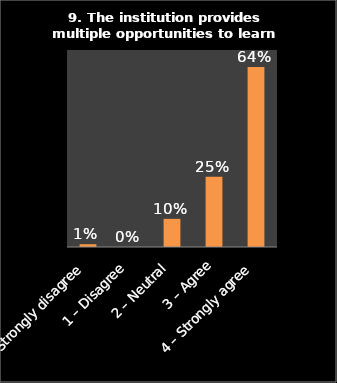
| Category | Series 0 |
|---|---|
| 0 – Strongly disagree | 0.01 |
| 1 – Disagree | 0 |
| 2 – Neutral | 0.1 |
| 3 – Agree | 0.25 |
| 4 – Strongly agree | 0.64 |